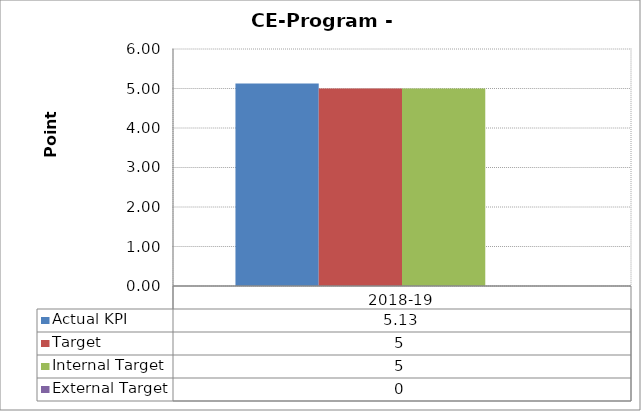
| Category | Actual KPI | Target  | Internal Target | External Target  |
|---|---|---|---|---|
| 2018-19 | 5.128 | 5 | 5 | 0 |